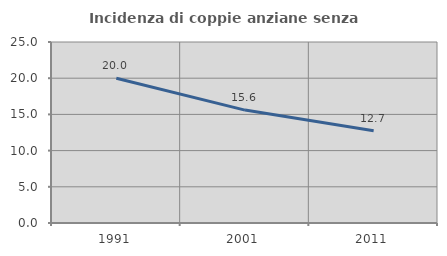
| Category | Incidenza di coppie anziane senza figli  |
|---|---|
| 1991.0 | 20 |
| 2001.0 | 15.596 |
| 2011.0 | 12.727 |